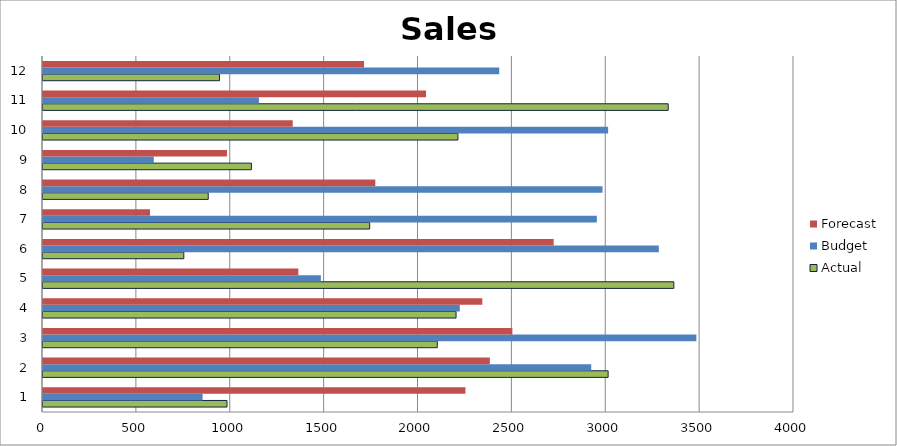
| Category | Actual | Budget | Forecast |
|---|---|---|---|
| 0 | 980 | 850 | 2250 |
| 1 | 3010 | 2920 | 2380 |
| 2 | 2100 | 3480 | 2500 |
| 3 | 2200 | 2220 | 2340 |
| 4 | 3360 | 1480 | 1360 |
| 5 | 750 | 3280 | 2720 |
| 6 | 1740 | 2950 | 570 |
| 7 | 880 | 2980 | 1770 |
| 8 | 1110 | 590 | 980 |
| 9 | 2210 | 3010 | 1330 |
| 10 | 3330 | 1150 | 2040 |
| 11 | 940 | 2430 | 1710 |